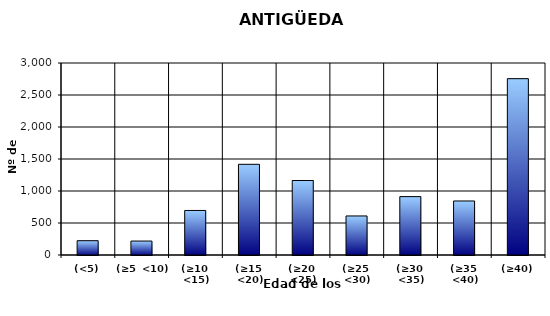
| Category | (<5) |
|---|---|
| (<5) | 223 |
| (≥5  <10) | 218 |
| (≥10  <15) | 696 |
| (≥15  <20) | 1417 |
| (≥20  <25) | 1164 |
| (≥25  <30) | 610 |
| (≥30  <35) | 912 |
| (≥35  <40) | 844 |
| (≥40) | 2755 |